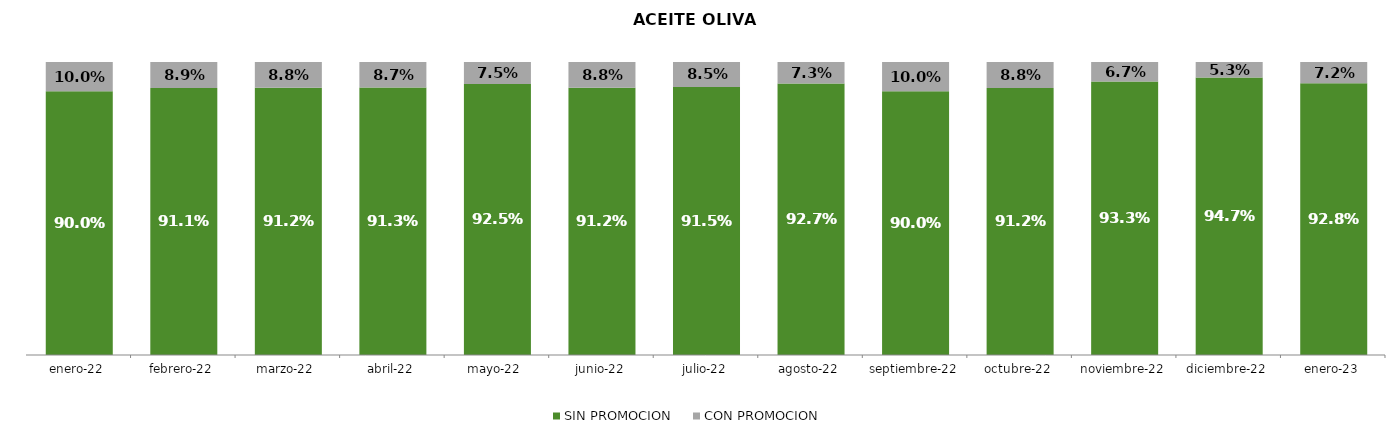
| Category | SIN PROMOCION   | CON PROMOCION   |
|---|---|---|
| 2022-01-01 | 0.9 | 0.1 |
| 2022-02-01 | 0.911 | 0.089 |
| 2022-03-01 | 0.912 | 0.088 |
| 2022-04-01 | 0.913 | 0.087 |
| 2022-05-01 | 0.925 | 0.075 |
| 2022-06-01 | 0.912 | 0.088 |
| 2022-07-01 | 0.915 | 0.085 |
| 2022-08-01 | 0.927 | 0.073 |
| 2022-09-01 | 0.9 | 0.1 |
| 2022-10-01 | 0.912 | 0.088 |
| 2022-11-01 | 0.933 | 0.067 |
| 2022-12-01 | 0.947 | 0.053 |
| 2023-01-01 | 0.928 | 0.072 |